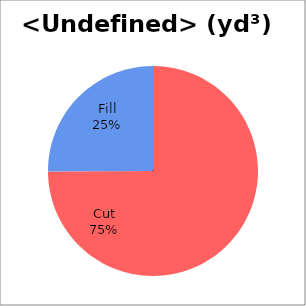
| Category | Series 0 |
|---|---|
| Cut | 16469.853 |
| Fill | 5511.969 |